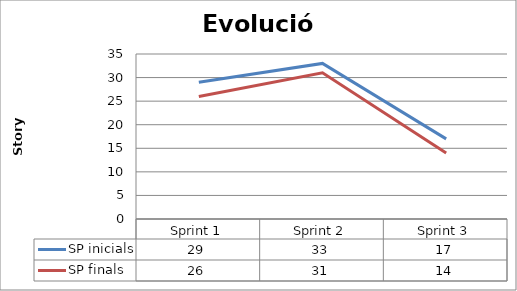
| Category | SP inicials | SP finals |
|---|---|---|
| Sprint 1 | 29 | 26 |
| Sprint 2 | 33 | 31 |
| Sprint 3 | 17 | 14 |